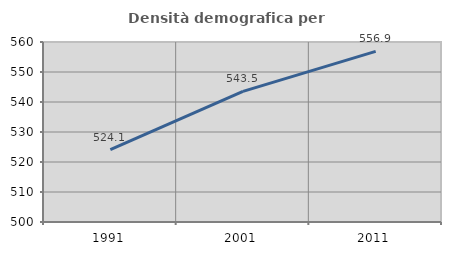
| Category | Densità demografica |
|---|---|
| 1991.0 | 524.107 |
| 2001.0 | 543.534 |
| 2011.0 | 556.863 |